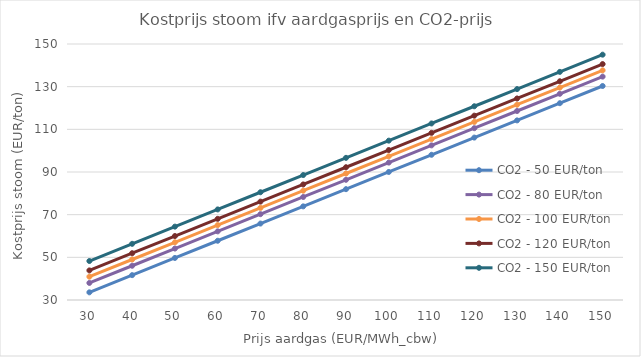
| Category | CO2 - 50 EUR/ton | CO2 - 80 EUR/ton | CO2 - 100 EUR/ton | CO2 - 120 EUR/ton | CO2 - 150 EUR/ton |
|---|---|---|---|---|---|
| 30.0 | 33.59 | 37.995 | 40.932 | 43.868 | 48.273 |
| 40.0 | 41.651 | 46.055 | 48.992 | 51.929 | 56.333 |
| 50.0 | 49.711 | 54.116 | 57.052 | 59.989 | 64.394 |
| 60.0 | 57.771 | 62.176 | 65.112 | 68.049 | 72.454 |
| 70.0 | 65.831 | 70.236 | 73.173 | 76.109 | 80.514 |
| 80.0 | 73.892 | 78.296 | 81.233 | 84.169 | 88.574 |
| 90.0 | 81.952 | 86.357 | 89.293 | 92.23 | 96.635 |
| 100.0 | 90.012 | 94.417 | 97.353 | 100.29 | 104.695 |
| 110.0 | 98.072 | 102.477 | 105.414 | 108.35 | 112.755 |
| 120.0 | 106.133 | 110.537 | 113.474 | 116.41 | 120.815 |
| 130.0 | 114.193 | 118.598 | 121.534 | 124.471 | 128.875 |
| 140.0 | 122.253 | 126.658 | 129.594 | 132.531 | 136.936 |
| 150.0 | 130.313 | 134.718 | 137.655 | 140.591 | 144.996 |